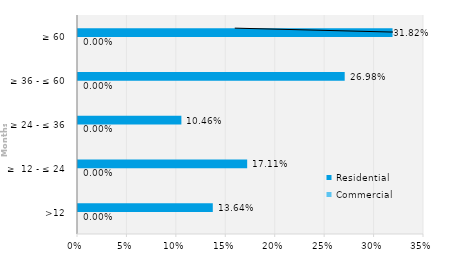
| Category | Commercial | Residential |
|---|---|---|
| >12 | 0 | 0.136 |
| ≥  12 - ≤ 24 | 0 | 0.171 |
| ≥ 24 - ≤ 36 | 0 | 0.105 |
| ≥ 36 - ≤ 60 | 0 | 0.27 |
| ≥ 60 | 0 | 0.318 |